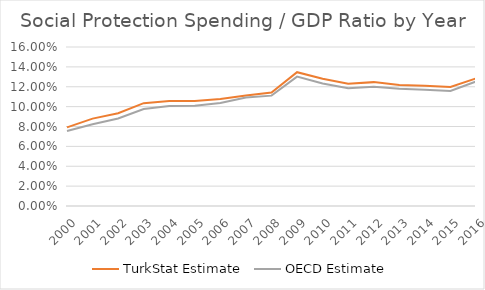
| Category | Nominal GDP | TurkStat Estimate | OECD Estimate |
|---|---|---|---|
| 2000.0 |  | 0.079 | 0.075 |
| 2001.0 |  | 0.088 | 0.082 |
| 2002.0 |  | 0.093 | 0.088 |
| 2003.0 |  | 0.103 | 0.098 |
| 2004.0 |  | 0.106 | 0.101 |
| 2005.0 |  | 0.106 | 0.101 |
| 2006.0 |  | 0.108 | 0.104 |
| 2007.0 |  | 0.111 | 0.109 |
| 2008.0 |  | 0.114 | 0.111 |
| 2009.0 |  | 0.135 | 0.13 |
| 2010.0 |  | 0.128 | 0.123 |
| 2011.0 |  | 0.123 | 0.119 |
| 2012.0 |  | 0.125 | 0.12 |
| 2013.0 |  | 0.122 | 0.118 |
| 2014.0 |  | 0.121 | 0.117 |
| 2015.0 |  | 0.12 | 0.116 |
| 2016.0 |  | 0.128 | 0.125 |